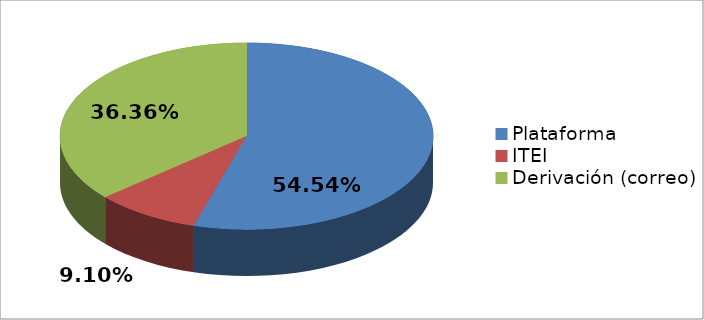
| Category | Series 0 | Series 1 |
|---|---|---|
| Plataforma | 6 | 0.545 |
| ITEI | 1 | 0.091 |
| Derivación (correo) | 4 | 0.364 |